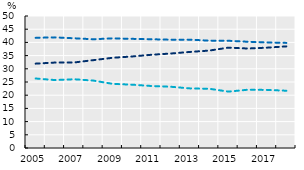
| Category | 15-29 | 30-49 | 50-69 |
|---|---|---|---|
| 2005.0 | 26.326 | 41.738 | 31.954 |
| 2006.0 | 25.735 | 41.905 | 32.362 |
| 2007.0 | 26.041 | 41.557 | 32.402 |
| 2008.0 | 25.526 | 41.192 | 33.281 |
| 2009.0 | 24.287 | 41.534 | 34.179 |
| 2010.0 | 23.987 | 41.347 | 34.666 |
| 2011.0 | 23.487 | 41.2 | 35.313 |
| 2012.0 | 23.202 | 41.018 | 35.781 |
| 2013.0 | 22.578 | 41.032 | 36.39 |
| 2014.0 | 22.434 | 40.666 | 36.901 |
| 2015.0 | 21.363 | 40.615 | 38.022 |
| 2016.0 | 22.072 | 40.245 | 37.682 |
| 2017.0 | 21.997 | 39.994 | 38.01 |
| 2018.0 | 21.695 | 39.813 | 38.492 |